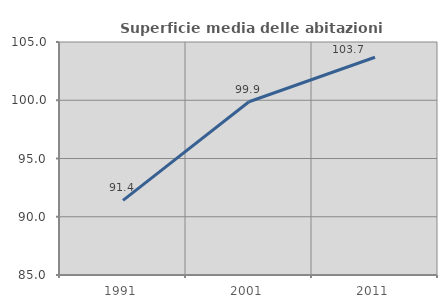
| Category | Superficie media delle abitazioni occupate |
|---|---|
| 1991.0 | 91.411 |
| 2001.0 | 99.87 |
| 2011.0 | 103.689 |